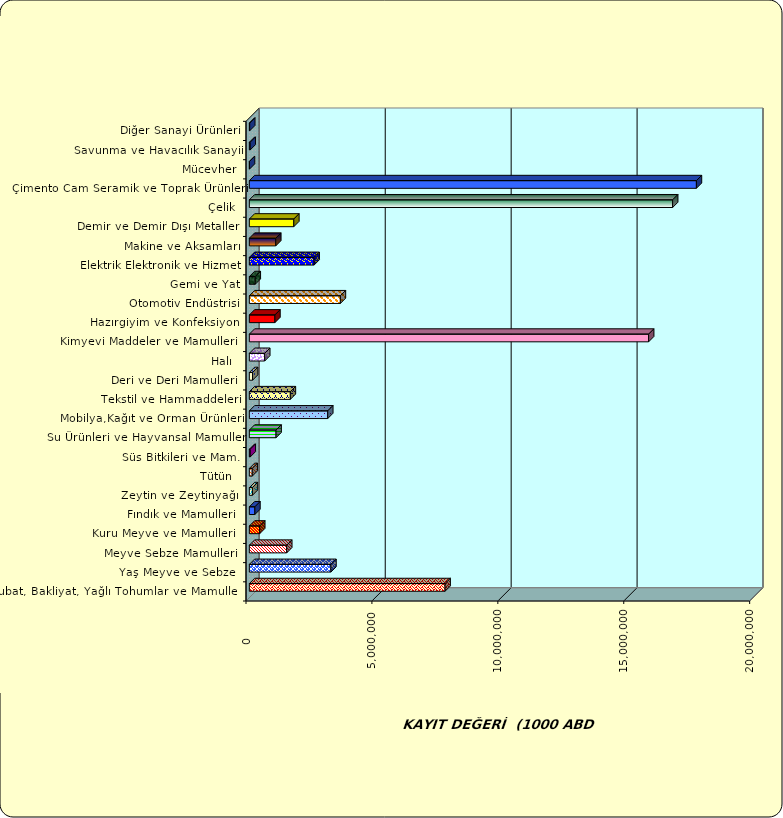
| Category | Series 0 |
|---|---|
|  Hububat, Bakliyat, Yağlı Tohumlar ve Mamulleri  | 7772624.749 |
|  Yaş Meyve ve Sebze   | 3239916.857 |
|  Meyve Sebze Mamulleri  | 1484227.532 |
|  Kuru Meyve ve Mamulleri   | 412093.939 |
|  Fındık ve Mamulleri  | 220215.224 |
|  Zeytin ve Zeytinyağı  | 121797.444 |
|  Tütün  | 115492.968 |
|  Süs Bitkileri ve Mam. | 35820.245 |
|  Su Ürünleri ve Hayvansal Mamuller | 1060699.652 |
|  Mobilya,Kağıt ve Orman Ürünleri | 3112712.816 |
|  Tekstil ve Hammaddeleri | 1627998.55 |
|  Deri ve Deri Mamulleri  | 127779.917 |
|  Halı  | 610296.362 |
|  Kimyevi Maddeler ve Mamulleri   | 15854949.678 |
|  Hazırgiyim ve Konfeksiyon  | 1014970.138 |
|  Otomotiv Endüstrisi | 3614469.181 |
|  Gemi ve Yat | 234564.705 |
|  Elektrik Elektronik ve Hizmet | 2571912.056 |
|  Makine ve Aksamları | 1049285.885 |
|  Demir ve Demir Dışı Metaller  | 1766002.872 |
|  Çelik | 16808639.406 |
|  Çimento Cam Seramik ve Toprak Ürünleri | 17752242.496 |
|  Mücevher | 4744.314 |
|  Savunma ve Havacılık Sanayii | 34175.181 |
|  Diğer Sanayi Ürünleri | 14667.664 |